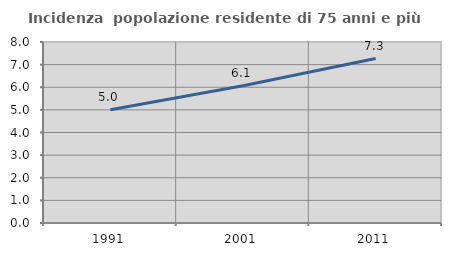
| Category | Incidenza  popolazione residente di 75 anni e più |
|---|---|
| 1991.0 | 5.005 |
| 2001.0 | 6.065 |
| 2011.0 | 7.269 |